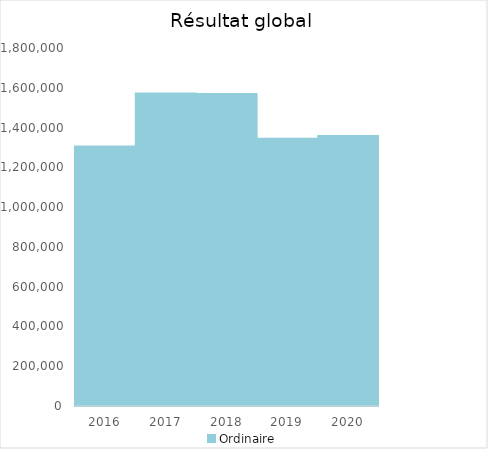
| Category |   | Ordinaire |    |
|---|---|---|---|
| 2016.0 |  | 1305178.18 |  |
| 2017.0 |  | 1571105.1 |  |
| 2018.0 |  | 1568921.87 |  |
| 2019.0 |  | 1344322.22 |  |
| 2020.0 |  | 1357068.51 |  |